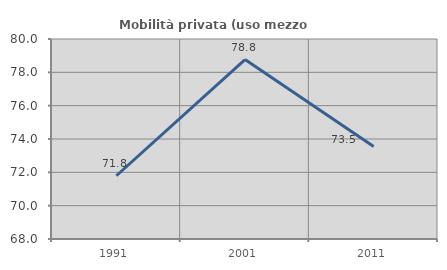
| Category | Mobilità privata (uso mezzo privato) |
|---|---|
| 1991.0 | 71.795 |
| 2001.0 | 78.767 |
| 2011.0 | 73.548 |